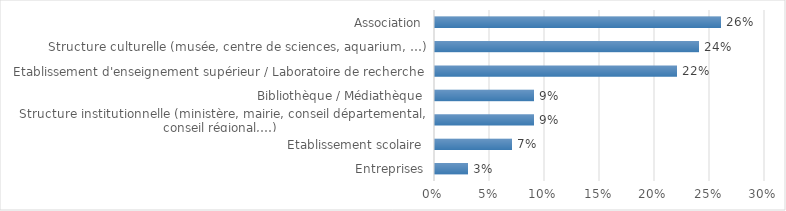
| Category | Entreprises |
|---|---|
| Entreprises | 0.03 |
| Etablissement scolaire | 0.07 |
| Structure institutionnelle (ministère, mairie, conseil départemental, conseil régional,…)  | 0.09 |
| Bibliothèque / Médiathèque | 0.09 |
| Etablissement d'enseignement supérieur / Laboratoire de recherche | 0.22 |
| Structure culturelle (musée, centre de sciences, aquarium, …) | 0.24 |
| Association | 0.26 |